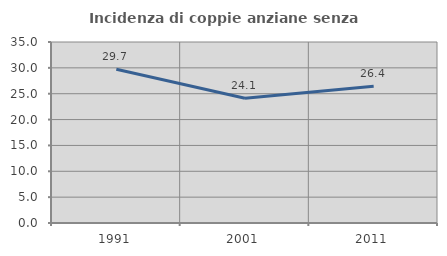
| Category | Incidenza di coppie anziane senza figli  |
|---|---|
| 1991.0 | 29.73 |
| 2001.0 | 24.113 |
| 2011.0 | 26.446 |